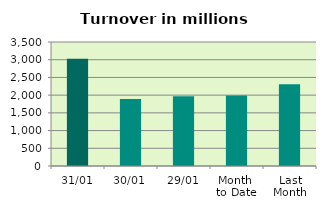
| Category | Series 0 |
|---|---|
| 31/01 | 3028.819 |
| 30/01 | 1894.188 |
| 29/01 | 1967.845 |
| Month 
to Date | 1988.014 |
| Last
Month | 2307.928 |